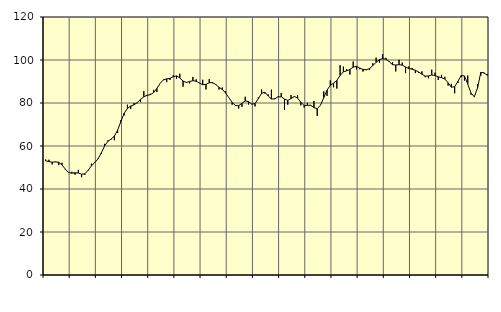
| Category | Piggar | Series 1 |
|---|---|---|
| nan | 53.7 | 53.11 |
| 87.0 | 53.6 | 52.75 |
| 87.0 | 51.4 | 52.47 |
| 87.0 | 52.7 | 52.59 |
| nan | 51.1 | 52.42 |
| 88.0 | 52.2 | 51.21 |
| 88.0 | 49.1 | 49.26 |
| 88.0 | 47.6 | 47.66 |
| nan | 48 | 47.34 |
| 89.0 | 46.6 | 47.58 |
| 89.0 | 48.9 | 47.41 |
| 89.0 | 45.5 | 46.87 |
| nan | 46.6 | 47.09 |
| 90.0 | 48.5 | 48.74 |
| 90.0 | 51.8 | 50.79 |
| 90.0 | 52.1 | 52.25 |
| nan | 54.1 | 53.95 |
| 91.0 | 56.3 | 56.77 |
| 91.0 | 61 | 59.95 |
| 91.0 | 62.6 | 62.14 |
| nan | 63 | 63.2 |
| 92.0 | 62.7 | 64.6 |
| 92.0 | 66.1 | 67.39 |
| 92.0 | 72.1 | 71.39 |
| nan | 74.3 | 75.21 |
| 93.0 | 79.2 | 77.5 |
| 93.0 | 77.2 | 78.6 |
| 93.0 | 80 | 79.16 |
| nan | 79.9 | 80.17 |
| 94.0 | 80.4 | 81.65 |
| 94.0 | 85.5 | 82.88 |
| 94.0 | 83.2 | 83.59 |
| nan | 84.3 | 83.87 |
| 95.0 | 86.1 | 84.85 |
| 95.0 | 85.1 | 86.79 |
| 95.0 | 89.2 | 89.17 |
| nan | 90.9 | 90.75 |
| 96.0 | 89.7 | 91.22 |
| 96.0 | 90.7 | 91.46 |
| 96.0 | 92.9 | 92.21 |
| nan | 91.3 | 92.62 |
| 97.0 | 93.6 | 91.69 |
| 97.0 | 87.6 | 90.2 |
| 97.0 | 89.7 | 89.55 |
| nan | 89.1 | 90 |
| 98.0 | 92.1 | 90.39 |
| 98.0 | 91 | 90.12 |
| 98.0 | 89.2 | 89.36 |
| nan | 90.8 | 88.49 |
| 99.0 | 86.3 | 88.67 |
| 99.0 | 91.1 | 89.41 |
| 99.0 | 89.2 | 89.5 |
| nan | 88.4 | 88.58 |
| 0.0 | 86.3 | 87.29 |
| 0.0 | 87.2 | 86.32 |
| 0.0 | 85.4 | 84.65 |
| nan | 82.5 | 82.47 |
| 1.0 | 79.2 | 80.34 |
| 1.0 | 79 | 78.79 |
| 1.0 | 77.4 | 78.75 |
| nan | 78.2 | 79.91 |
| 2.0 | 82.9 | 80.96 |
| 2.0 | 79.3 | 80.65 |
| 2.0 | 79.6 | 79.46 |
| nan | 78.4 | 79.72 |
| 3.0 | 82.6 | 82.02 |
| 3.0 | 86.3 | 84.48 |
| 3.0 | 84.4 | 84.96 |
| nan | 84 | 83.35 |
| 4.0 | 86.2 | 81.86 |
| 4.0 | 82.2 | 81.92 |
| 4.0 | 82.8 | 82.87 |
| nan | 84.7 | 82.92 |
| 5.0 | 76.8 | 81.85 |
| 5.0 | 79.2 | 81.19 |
| 5.0 | 83.7 | 82.03 |
| nan | 82.8 | 83.04 |
| 6.0 | 83.6 | 82.28 |
| 6.0 | 78.9 | 80.36 |
| 6.0 | 77.9 | 78.85 |
| nan | 80.1 | 78.91 |
| 7.0 | 78.7 | 78.96 |
| 7.0 | 80.9 | 77.83 |
| 7.0 | 74 | 77.37 |
| nan | 79 | 78.97 |
| 8.0 | 85.4 | 82.52 |
| 8.0 | 83.3 | 86.02 |
| 8.0 | 90.5 | 88.16 |
| nan | 87.3 | 89.24 |
| 9.0 | 86.7 | 90.51 |
| 9.0 | 97.6 | 92.83 |
| 9.0 | 96.9 | 94.53 |
| nan | 95.7 | 94.96 |
| 10.0 | 93.2 | 95.63 |
| 10.0 | 99.3 | 96.68 |
| 10.0 | 95.6 | 97.03 |
| nan | 95.7 | 96.26 |
| 11.0 | 94.6 | 95.62 |
| 11.0 | 95.3 | 95.45 |
| 11.0 | 95.3 | 95.99 |
| nan | 98.5 | 97.42 |
| 12.0 | 101.1 | 98.94 |
| 12.0 | 98.8 | 100.16 |
| 12.0 | 102.7 | 100.58 |
| nan | 101 | 100.41 |
| 13.0 | 99.1 | 99.25 |
| 13.0 | 99 | 97.86 |
| 13.0 | 94.7 | 97.64 |
| nan | 100.1 | 97.86 |
| 14.0 | 98.8 | 97.59 |
| 14.0 | 93.9 | 96.76 |
| 14.0 | 97 | 96 |
| nan | 96.3 | 95.7 |
| 15.0 | 93.9 | 95.22 |
| 15.0 | 94 | 94.41 |
| 15.0 | 94.7 | 93.41 |
| nan | 92 | 92.48 |
| 16.0 | 91.5 | 92.58 |
| 16.0 | 95.5 | 93.03 |
| 16.0 | 94.1 | 92.77 |
| nan | 90.7 | 92.2 |
| 17.0 | 93.1 | 91.78 |
| 17.0 | 92.2 | 91.16 |
| 17.0 | 88.1 | 89.41 |
| nan | 88.9 | 87.36 |
| 18.0 | 84.5 | 87.53 |
| 18.0 | 89.3 | 90.07 |
| 18.0 | 92.1 | 92.8 |
| nan | 90.4 | 92.58 |
| 19.0 | 92.8 | 88.83 |
| 19.0 | 83.9 | 84.62 |
| 19.0 | 82.7 | 82.88 |
| nan | 88.7 | 87.03 |
| 20.0 | 92.8 | 94.25 |
| 20.0 | 93.8 | 94.02 |
| 20.0 | 93.5 | 92.84 |